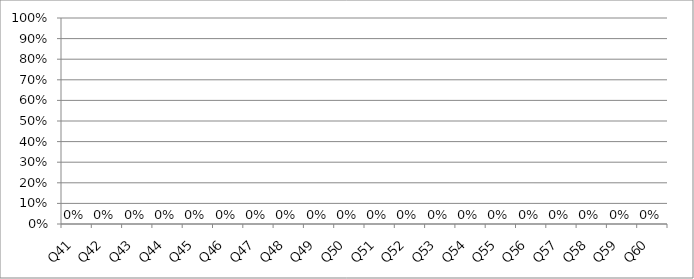
| Category | CIÊNCIAS |
|---|---|
| Q41 | 0 |
| Q42 | 0 |
| Q43 | 0 |
| Q44 | 0 |
| Q45 | 0 |
| Q46 | 0 |
| Q47 | 0 |
| Q48 | 0 |
| Q49 | 0 |
| Q50 | 0 |
| Q51 | 0 |
| Q52 | 0 |
| Q53 | 0 |
| Q54 | 0 |
| Q55 | 0 |
| Q56 | 0 |
| Q57 | 0 |
| Q58 | 0 |
| Q59 | 0 |
| Q60 | 0 |